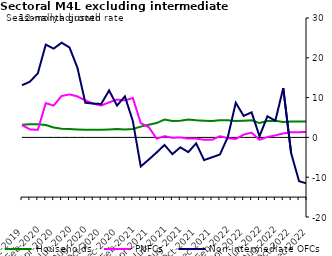
| Category | zero | Households | PNFCs | Non-intermediate OFCs |
|---|---|---|---|---|
| Dec-2019 | 0 | 3.2 | 3.1 | 13.1 |
| Jan-2020 | 0 | 3.3 | 2 | 14 |
| Feb-2020 | 0 | 3.3 | 1.9 | 16.1 |
| Mar-2020 | 0 | 3.1 | 8.6 | 23.3 |
| Apr-2020 | 0 | 2.5 | 8 | 22.3 |
| May-2020 | 0 | 2.2 | 10.4 | 23.8 |
| Jun-2020 | 0 | 2.1 | 10.8 | 22.6 |
| Jul-2020 | 0 | 2 | 10.3 | 17.5 |
| Aug-2020 | 0 | 1.9 | 9.3 | 8.7 |
| Sep-2020 | 0 | 1.9 | 8.5 | 8.5 |
| Oct-2020 | 0 | 1.9 | 8 | 8.4 |
| Nov-2020 | 0 | 2 | 8.8 | 11.8 |
| Dec-2020 | 0 | 2.1 | 9.5 | 8 |
| Jan-2021 | 0 | 2 | 9.3 | 10.3 |
| Feb-2021 | 0 | 2.1 | 9.9 | 4.1 |
| Mar-2021 | 0 | 2.7 | 3.6 | -7.3 |
| Apr-2021 | 0 | 3.2 | 2.6 | -5.6 |
| May-2021 | 0 | 3.6 | -0.3 | -3.8 |
| Jun-2021 | 0 | 4.5 | 0.3 | -1.9 |
| Jul-2021 | 0 | 4.1 | -0.1 | -4.2 |
| Aug-2021 | 0 | 4.2 | 0 | -2.5 |
| Sep-2021 | 0 | 4.5 | -0.3 | -3.7 |
| Oct-2021 | 0 | 4.3 | -0.3 | -1.5 |
| Nov-2021 | 0 | 4.2 | -0.6 | -5.7 |
| Dec-2021 | 0 | 4.1 | -0.6 | -5 |
| Jan-2022 | 0 | 4.3 | 0.3 | -4.3 |
| Feb-2022 | 0 | 4.3 | -0.2 | 0.1 |
| Mar-2022 | 0 | 4.1 | -0.4 | 8.7 |
| Apr-2022 | 0 | 4.2 | 0.7 | 5.4 |
| May-2022 | 0 | 4.3 | 1.2 | 6.3 |
| Jun-2022 | 0 | 3.6 | -0.6 | 0.3 |
| Jul-2022 | 0 | 4.1 | 0.1 | 5.3 |
| Aug-2022 | 0 | 4.2 | 0.5 | 4.2 |
| Sep-2022 | 0 | 3.9 | 1 | 12.4 |
| Oct-2022 | 0 | 4 | 1.3 | -4 |
| Nov-2022 | 0 | 4 | 1.3 | -11 |
| Dec-2022 | 0 | 4 | 1.4 | -11.6 |